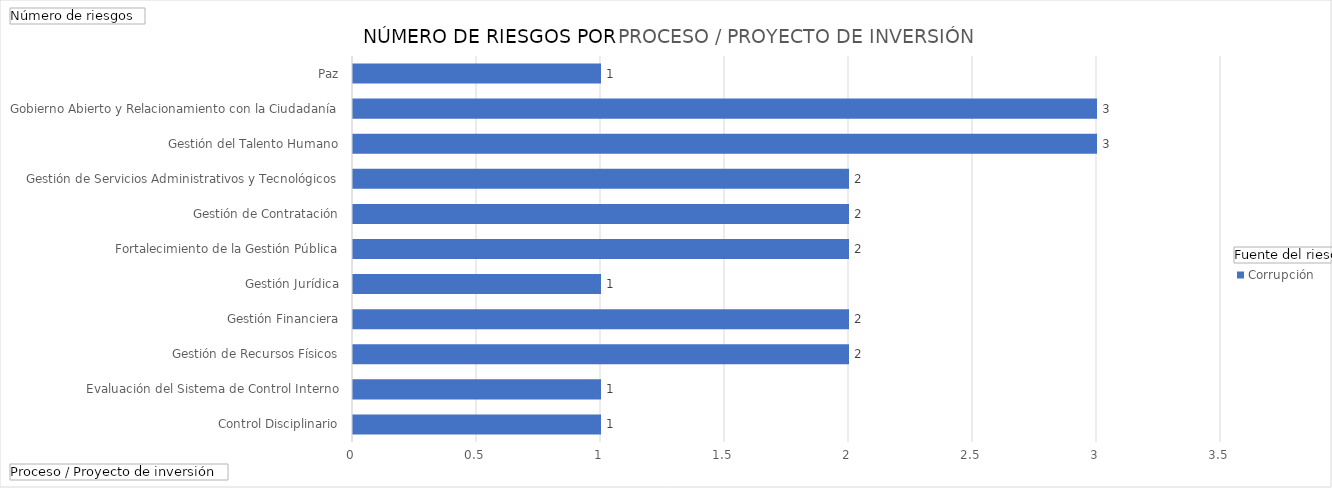
| Category | Corrupción |
|---|---|
| Control Disciplinario | 1 |
| Evaluación del Sistema de Control Interno | 1 |
| Gestión de Recursos Físicos | 2 |
| Gestión Financiera | 2 |
| Gestión Jurídica | 1 |
| Fortalecimiento de la Gestión Pública | 2 |
| Gestión de Contratación | 2 |
| Gestión de Servicios Administrativos y Tecnológicos | 2 |
| Gestión del Talento Humano | 3 |
| Gobierno Abierto y Relacionamiento con la Ciudadanía | 3 |
| Paz, Víctimas y Reconciliación | 1 |